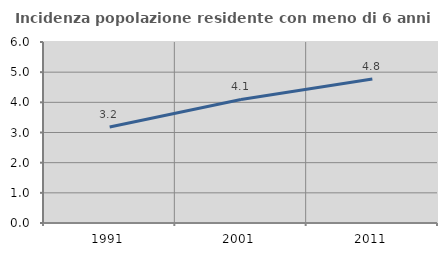
| Category | Incidenza popolazione residente con meno di 6 anni |
|---|---|
| 1991.0 | 3.183 |
| 2001.0 | 4.095 |
| 2011.0 | 4.772 |